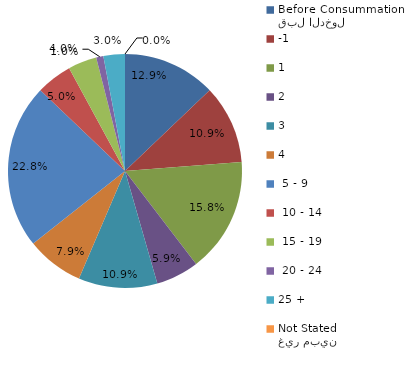
| Category | Series 0 |
|---|---|
| قبل الدخول
Before Consummation | 12.871 |
| -1 | 10.891 |
| 1 | 15.842 |
| 2 | 5.941 |
| 3 | 10.891 |
| 4 | 7.921 |
|  5 - 9 | 22.772 |
|  10 - 14 | 4.95 |
|  15 - 19 | 3.96 |
|  20 - 24 | 0.99 |
| 25 + | 2.97 |
| غير مبين
Not Stated | 0 |